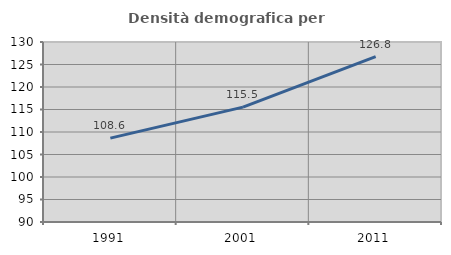
| Category | Densità demografica |
|---|---|
| 1991.0 | 108.647 |
| 2001.0 | 115.521 |
| 2011.0 | 126.768 |